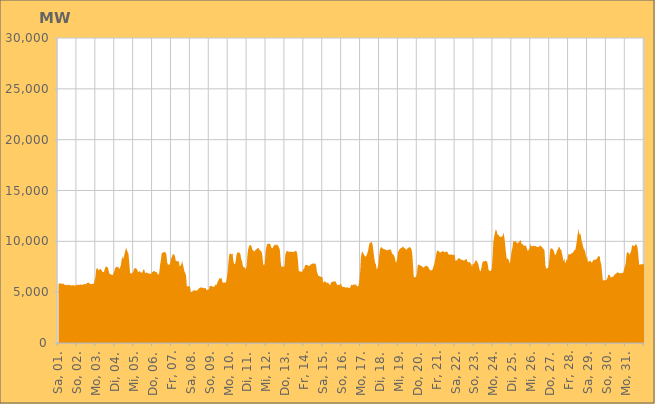
| Category | Series 0 |
|---|---|
|  Sa, 01.  | 5816.645 |
|  Sa, 01.  | 5833.543 |
|  Sa, 01.  | 5878.303 |
|  Sa, 01.  | 5857.941 |
|  Sa, 01.  | 5813.265 |
|  Sa, 01.  | 5821.119 |
|  Sa, 01.  | 5837.739 |
|  Sa, 01.  | 5802.961 |
|  Sa, 01.  | 5689.866 |
|  Sa, 01.  | 5706.973 |
|  Sa, 01.  | 5746.444 |
|  Sa, 01.  | 5684.061 |
|  Sa, 01.  | 5675.077 |
|  Sa, 01.  | 5747.231 |
|  Sa, 01.  | 5696.024 |
|  Sa, 01.  | 5694.07 |
|  Sa, 01.  | 5654.242 |
|  So, 02.  | 5658.602 |
|  So, 02.  | 5678.763 |
|  So, 02.  | 5686.817 |
|  So, 02.  | 5690.824 |
|  So, 02.  | 5626.609 |
|  So, 02.  | 5655.638 |
|  So, 02.  | 5686.847 |
|  So, 02.  | 5718.053 |
|  So, 02.  | 5741.912 |
|  So, 02.  | 5723.226 |
|  So, 02.  | 5712.971 |
|  So, 02.  | 5752.09 |
|  So, 02.  | 5741.328 |
|  So, 02.  | 5719.374 |
|  So, 02.  | 5738.254 |
|  So, 02.  | 5760.395 |
|  So, 02.  | 5807.948 |
|  So, 02.  | 5769.934 |
|  So, 02.  | 5794.8 |
|  So, 02.  | 5873.427 |
|  So, 02.  | 5922.036 |
|  So, 02.  | 5951.451 |
|  So, 02.  | 5889.006 |
|  So, 02.  | 5823.399 |
|  Mo, 03.  | 5801.55 |
|  Mo, 03.  | 5783.594 |
|  Mo, 03.  | 5803.917 |
|  Mo, 03.  | 5863.852 |
|  Mo, 03.  | 5818.78 |
|  Mo, 03.  | 6150.119 |
|  Mo, 03.  | 6477.918 |
|  Mo, 03.  | 7246.866 |
|  Mo, 03.  | 7374.99 |
|  Mo, 03.  | 7302.703 |
|  Mo, 03.  | 7142.576 |
|  Mo, 03.  | 7207.253 |
|  Mo, 03.  | 7280.673 |
|  Mo, 03.  | 7236.952 |
|  Mo, 03.  | 7135.298 |
|  Mo, 03.  | 6977.488 |
|  Mo, 03.  | 6979.522 |
|  Mo, 03.  | 7014.922 |
|  Mo, 03.  | 7313.559 |
|  Mo, 03.  | 7509.86 |
|  Mo, 03.  | 7513.885 |
|  Mo, 03.  | 7453.817 |
|  Mo, 03.  | 7392.772 |
|  Mo, 03.  | 7028.867 |
|  Di, 04.  | 6792.602 |
|  Di, 04.  | 6759.848 |
|  Di, 04.  | 6725.431 |
|  Di, 04.  | 6704.139 |
|  Di, 04.  | 6676.318 |
|  Di, 04.  | 6860.12 |
|  Di, 04.  | 7063.228 |
|  Di, 04.  | 7350.182 |
|  Di, 04.  | 7444.126 |
|  Di, 04.  | 7520.977 |
|  Di, 04.  | 7445.293 |
|  Di, 04.  | 7506.227 |
|  Di, 04.  | 7278.195 |
|  Di, 04.  | 7381.013 |
|  Di, 04.  | 7568.613 |
|  Di, 04.  | 8020.551 |
|  Di, 04.  | 8530.86 |
|  Di, 04.  | 8246.213 |
|  Di, 04.  | 8458.674 |
|  Di, 04.  | 8795.813 |
|  Di, 04.  | 9079.876 |
|  Di, 04.  | 9411.815 |
|  Di, 04.  | 9123.386 |
|  Di, 04.  | 8925.755 |
|  Mi, 05.  | 8757.629 |
|  Mi, 05.  | 7834.974 |
|  Mi, 05.  | 6837.615 |
|  Mi, 05.  | 6862.49 |
|  Mi, 05.  | 6850.363 |
|  Mi, 05.  | 6859.199 |
|  Mi, 05.  | 7006.838 |
|  Mi, 05.  | 7296.715 |
|  Mi, 05.  | 7348.667 |
|  Mi, 05.  | 7348.336 |
|  Mi, 05.  | 7333.06 |
|  Mi, 05.  | 7198.092 |
|  Mi, 05.  | 7009.681 |
|  Mi, 05.  | 7006.514 |
|  Mi, 05.  | 7059.808 |
|  Mi, 05.  | 7008.077 |
|  Mi, 05.  | 6918.037 |
|  Mi, 05.  | 6908.768 |
|  Mi, 05.  | 7042.755 |
|  Mi, 05.  | 7244.263 |
|  Mi, 05.  | 7229.735 |
|  Mi, 05.  | 6877.318 |
|  Mi, 05.  | 6890.779 |
|  Mi, 05.  | 6954.877 |
|  Do, 06.  | 6883.115 |
|  Do, 06.  | 6867.891 |
|  Do, 06.  | 6839.421 |
|  Do, 06.  | 6826.506 |
|  Do, 06.  | 6793.835 |
|  Do, 06.  | 6833.562 |
|  Do, 06.  | 6956.212 |
|  Do, 06.  | 7022.158 |
|  Do, 06.  | 7082.01 |
|  Do, 06.  | 7082.8 |
|  Do, 06.  | 6989.652 |
|  Do, 06.  | 6961.695 |
|  Do, 06.  | 6970.174 |
|  Do, 06.  | 6761.176 |
|  Do, 06.  | 6702.267 |
|  Do, 06.  | 6901.719 |
|  Do, 06.  | 7656.183 |
|  Do, 06.  | 8089.277 |
|  Do, 06.  | 8770.813 |
|  Do, 06.  | 8903.225 |
|  Do, 06.  | 8871.869 |
|  Do, 06.  | 8965.693 |
|  Do, 06.  | 8958.308 |
|  Do, 06.  | 8885.879 |
|  Fr, 07.  | 8728.444 |
|  Fr, 07.  | 7938.784 |
|  Fr, 07.  | 7748.353 |
|  Fr, 07.  | 7690.487 |
|  Fr, 07.  | 7713.119 |
|  Fr, 07.  | 7869.529 |
|  Fr, 07.  | 8298.049 |
|  Fr, 07.  | 8468.729 |
|  Fr, 07.  | 8720.527 |
|  Fr, 07.  | 8723.164 |
|  Fr, 07.  | 8695.998 |
|  Fr, 07.  | 8494.027 |
|  Fr, 07.  | 8103.364 |
|  Fr, 07.  | 8059.796 |
|  Fr, 07.  | 8010.399 |
|  Fr, 07.  | 8073.989 |
|  Fr, 07.  | 7977.426 |
|  Fr, 07.  | 7513.191 |
|  Fr, 07.  | 7624.428 |
|  Fr, 07.  | 7744.57 |
|  Fr, 07.  | 8069.878 |
|  Fr, 07.  | 7706.442 |
|  Fr, 07.  | 7399.259 |
|  Fr, 07.  | 7028.124 |
|  Sa, 08.  | 6890.17 |
|  Sa, 08.  | 6633.674 |
|  Sa, 08.  | 5583.252 |
|  Sa, 08.  | 5564.435 |
|  Sa, 08.  | 5583.643 |
|  Sa, 08.  | 5573.113 |
|  Sa, 08.  | 5556.129 |
|  Sa, 08.  | 5023.71 |
|  Sa, 08.  | 4995.188 |
|  Sa, 08.  | 5069.046 |
|  Sa, 08.  | 5132.695 |
|  Sa, 08.  | 5204.033 |
|  Sa, 08.  | 5167.089 |
|  Sa, 08.  | 5138.09 |
|  Sa, 08.  | 5182.6 |
|  Sa, 08.  | 5157.39 |
|  Sa, 08.  | 5227.657 |
|  Sa, 08.  | 5363.04 |
|  Sa, 08.  | 5380.065 |
|  Sa, 08.  | 5452.833 |
|  Sa, 08.  | 5485.961 |
|  Sa, 08.  | 5410.585 |
|  Sa, 08.  | 5438.915 |
|  Sa, 08.  | 5428.35 |
|  So, 09.  | 5375.162 |
|  So, 09.  | 5404.283 |
|  So, 09.  | 5402.728 |
|  So, 09.  | 5205.05 |
|  So, 09.  | 5212.213 |
|  So, 09.  | 5258.721 |
|  So, 09.  | 5272.45 |
|  So, 09.  | 5593.631 |
|  So, 09.  | 5615.266 |
|  So, 09.  | 5595.161 |
|  So, 09.  | 5591.979 |
|  So, 09.  | 5521.389 |
|  So, 09.  | 5542.245 |
|  So, 09.  | 5535.385 |
|  So, 09.  | 5783.627 |
|  So, 09.  | 5646.973 |
|  So, 09.  | 5775.65 |
|  So, 09.  | 6012.055 |
|  So, 09.  | 6129.645 |
|  So, 09.  | 6331.812 |
|  So, 09.  | 6343.101 |
|  So, 09.  | 6365.223 |
|  So, 09.  | 6414.256 |
|  So, 09.  | 6066.495 |
|  Mo, 10.  | 5862.603 |
|  Mo, 10.  | 5992.653 |
|  Mo, 10.  | 5934.192 |
|  Mo, 10.  | 5924.828 |
|  Mo, 10.  | 6036.854 |
|  Mo, 10.  | 6538.78 |
|  Mo, 10.  | 7059.697 |
|  Mo, 10.  | 8112.811 |
|  Mo, 10.  | 8721.013 |
|  Mo, 10.  | 8805.023 |
|  Mo, 10.  | 8772.207 |
|  Mo, 10.  | 8703.89 |
|  Mo, 10.  | 8845.539 |
|  Mo, 10.  | 8087.793 |
|  Mo, 10.  | 7780.251 |
|  Mo, 10.  | 7770.305 |
|  Mo, 10.  | 8039.012 |
|  Mo, 10.  | 8665.154 |
|  Mo, 10.  | 8888.458 |
|  Mo, 10.  | 8935.315 |
|  Mo, 10.  | 8905.289 |
|  Mo, 10.  | 8853.081 |
|  Mo, 10.  | 8746.301 |
|  Mo, 10.  | 8243.078 |
|  Di, 11.  | 8076.741 |
|  Di, 11.  | 7618.206 |
|  Di, 11.  | 7450.382 |
|  Di, 11.  | 7466.179 |
|  Di, 11.  | 7333.327 |
|  Di, 11.  | 7285.132 |
|  Di, 11.  | 7608.018 |
|  Di, 11.  | 8728.886 |
|  Di, 11.  | 9264.709 |
|  Di, 11.  | 9504.386 |
|  Di, 11.  | 9663.652 |
|  Di, 11.  | 9604.285 |
|  Di, 11.  | 9559.634 |
|  Di, 11.  | 9158.651 |
|  Di, 11.  | 9147.085 |
|  Di, 11.  | 9018.373 |
|  Di, 11.  | 8982.463 |
|  Di, 11.  | 9143.314 |
|  Di, 11.  | 9197.656 |
|  Di, 11.  | 9277.22 |
|  Di, 11.  | 9310.658 |
|  Di, 11.  | 9376.442 |
|  Di, 11.  | 9167.203 |
|  Di, 11.  | 9124.177 |
|  Mi, 12.  | 9011.812 |
|  Mi, 12.  | 8967.782 |
|  Mi, 12.  | 8471.028 |
|  Mi, 12.  | 7726.223 |
|  Mi, 12.  | 7650.477 |
|  Mi, 12.  | 7843.347 |
|  Mi, 12.  | 8981.361 |
|  Mi, 12.  | 9456.083 |
|  Mi, 12.  | 9724.692 |
|  Mi, 12.  | 9778.336 |
|  Mi, 12.  | 9747.473 |
|  Mi, 12.  | 9770.066 |
|  Mi, 12.  | 9734.751 |
|  Mi, 12.  | 9423.838 |
|  Mi, 12.  | 9354.22 |
|  Mi, 12.  | 9314.765 |
|  Mi, 12.  | 9557.487 |
|  Mi, 12.  | 9573.405 |
|  Mi, 12.  | 9679.934 |
|  Mi, 12.  | 9663.049 |
|  Mi, 12.  | 9635.505 |
|  Mi, 12.  | 9676.409 |
|  Mi, 12.  | 9518.97 |
|  Mi, 12.  | 9400.222 |
|  Do, 13.  | 9177.221 |
|  Do, 13.  | 8114.647 |
|  Do, 13.  | 7474.019 |
|  Do, 13.  | 7521.745 |
|  Do, 13.  | 7550.099 |
|  Do, 13.  | 7455.895 |
|  Do, 13.  | 7618.635 |
|  Do, 13.  | 8671.474 |
|  Do, 13.  | 8952.748 |
|  Do, 13.  | 9020.485 |
|  Do, 13.  | 9061.058 |
|  Do, 13.  | 8995.396 |
|  Do, 13.  | 8938.462 |
|  Do, 13.  | 8982.585 |
|  Do, 13.  | 8995.896 |
|  Do, 13.  | 8980.986 |
|  Do, 13.  | 8951.993 |
|  Do, 13.  | 8934.699 |
|  Do, 13.  | 9009.636 |
|  Do, 13.  | 9005.158 |
|  Do, 13.  | 9070.245 |
|  Do, 13.  | 9029.002 |
|  Do, 13.  | 8829.298 |
|  Do, 13.  | 8151.87 |
|  Fr, 14.  | 7112.168 |
|  Fr, 14.  | 7048.001 |
|  Fr, 14.  | 7022.656 |
|  Fr, 14.  | 7016.211 |
|  Fr, 14.  | 7034.101 |
|  Fr, 14.  | 7057.394 |
|  Fr, 14.  | 7293.224 |
|  Fr, 14.  | 7311.797 |
|  Fr, 14.  | 7641.42 |
|  Fr, 14.  | 7675.639 |
|  Fr, 14.  | 7690.102 |
|  Fr, 14.  | 7672.385 |
|  Fr, 14.  | 7606.425 |
|  Fr, 14.  | 7559.866 |
|  Fr, 14.  | 7623.79 |
|  Fr, 14.  | 7710.316 |
|  Fr, 14.  | 7736.737 |
|  Fr, 14.  | 7799.67 |
|  Fr, 14.  | 7825.986 |
|  Fr, 14.  | 7796.022 |
|  Fr, 14.  | 7814.803 |
|  Fr, 14.  | 7825.5 |
|  Fr, 14.  | 7663.729 |
|  Fr, 14.  | 7058.757 |
|  Sa, 15.  | 6807.523 |
|  Sa, 15.  | 6598.887 |
|  Sa, 15.  | 6564.394 |
|  Sa, 15.  | 6570.078 |
|  Sa, 15.  | 6496.994 |
|  Sa, 15.  | 6482.944 |
|  Sa, 15.  | 6507.312 |
|  Sa, 15.  | 5905.573 |
|  Sa, 15.  | 6044.369 |
|  Sa, 15.  | 6088.623 |
|  Sa, 15.  | 6019.353 |
|  Sa, 15.  | 5937.678 |
|  Sa, 15.  | 5898.209 |
|  Sa, 15.  | 5962.256 |
|  Sa, 15.  | 5866.236 |
|  Sa, 15.  | 5707.587 |
|  Sa, 15.  | 5719.776 |
|  Sa, 15.  | 5942.887 |
|  Sa, 15.  | 5997.819 |
|  Sa, 15.  | 6032.344 |
|  Sa, 15.  | 6057.356 |
|  Sa, 15.  | 6030.518 |
|  Sa, 15.  | 6065.009 |
|  Sa, 15.  | 6052.457 |
|  So, 16.  | 5836.638 |
|  So, 16.  | 5706.575 |
|  So, 16.  | 5707.869 |
|  So, 16.  | 5726.732 |
|  So, 16.  | 5731.288 |
|  So, 16.  | 5771.135 |
|  So, 16.  | 5782.073 |
|  So, 16.  | 5524.822 |
|  So, 16.  | 5534.935 |
|  So, 16.  | 5508.416 |
|  So, 16.  | 5512.746 |
|  So, 16.  | 5473.049 |
|  So, 16.  | 5415.752 |
|  So, 16.  | 5483.737 |
|  So, 16.  | 5476.291 |
|  So, 16.  | 5433.365 |
|  So, 16.  | 5415.68 |
|  So, 16.  | 5426.402 |
|  So, 16.  | 5588.846 |
|  So, 16.  | 5741.849 |
|  So, 16.  | 5697.924 |
|  So, 16.  | 5682.73 |
|  So, 16.  | 5792.837 |
|  So, 16.  | 5728.978 |
|  Mo, 17.  | 5755.943 |
|  Mo, 17.  | 5716.872 |
|  Mo, 17.  | 5539.913 |
|  Mo, 17.  | 5580.236 |
|  Mo, 17.  | 5669.963 |
|  Mo, 17.  | 6192.205 |
|  Mo, 17.  | 6990.774 |
|  Mo, 17.  | 8472.941 |
|  Mo, 17.  | 8877.639 |
|  Mo, 17.  | 8995.747 |
|  Mo, 17.  | 8825.526 |
|  Mo, 17.  | 8648.156 |
|  Mo, 17.  | 8563.979 |
|  Mo, 17.  | 8469.505 |
|  Mo, 17.  | 8596.41 |
|  Mo, 17.  | 8808.88 |
|  Mo, 17.  | 9063.486 |
|  Mo, 17.  | 9494.846 |
|  Mo, 17.  | 9824.431 |
|  Mo, 17.  | 9879.286 |
|  Mo, 17.  | 9902.182 |
|  Mo, 17.  | 9908.689 |
|  Mo, 17.  | 9541.884 |
|  Mo, 17.  | 8942.173 |
|  Di, 18.  | 8304.556 |
|  Di, 18.  | 7866.418 |
|  Di, 18.  | 7752.92 |
|  Di, 18.  | 7232.025 |
|  Di, 18.  | 7388.881 |
|  Di, 18.  | 7755.89 |
|  Di, 18.  | 8489.874 |
|  Di, 18.  | 9165.235 |
|  Di, 18.  | 9379.632 |
|  Di, 18.  | 9427.655 |
|  Di, 18.  | 9375.063 |
|  Di, 18.  | 9253.425 |
|  Di, 18.  | 9247.663 |
|  Di, 18.  | 9211.881 |
|  Di, 18.  | 9193.004 |
|  Di, 18.  | 9156.579 |
|  Di, 18.  | 9080.882 |
|  Di, 18.  | 9145.31 |
|  Di, 18.  | 9149.555 |
|  Di, 18.  | 9205.161 |
|  Di, 18.  | 9170.764 |
|  Di, 18.  | 9214.088 |
|  Di, 18.  | 8915.83 |
|  Di, 18.  | 8735.805 |
|  Mi, 19.  | 8722.167 |
|  Mi, 19.  | 8562.322 |
|  Mi, 19.  | 8399.129 |
|  Mi, 19.  | 7986.45 |
|  Mi, 19.  | 7917.184 |
|  Mi, 19.  | 8352.722 |
|  Mi, 19.  | 8907.322 |
|  Mi, 19.  | 9083.245 |
|  Mi, 19.  | 9235.338 |
|  Mi, 19.  | 9299.777 |
|  Mi, 19.  | 9355.43 |
|  Mi, 19.  | 9374.602 |
|  Mi, 19.  | 9496.208 |
|  Mi, 19.  | 9420.226 |
|  Mi, 19.  | 9331.025 |
|  Mi, 19.  | 9299.388 |
|  Mi, 19.  | 9196.505 |
|  Mi, 19.  | 9199.866 |
|  Mi, 19.  | 9297.241 |
|  Mi, 19.  | 9348.211 |
|  Mi, 19.  | 9396.245 |
|  Mi, 19.  | 9458.066 |
|  Mi, 19.  | 9352.916 |
|  Mi, 19.  | 9249.11 |
|  Do, 20.  | 8873.193 |
|  Do, 20.  | 7791.259 |
|  Do, 20.  | 6537.543 |
|  Do, 20.  | 6453.17 |
|  Do, 20.  | 6468.559 |
|  Do, 20.  | 6549.581 |
|  Do, 20.  | 6835.472 |
|  Do, 20.  | 7594.804 |
|  Do, 20.  | 7722.34 |
|  Do, 20.  | 7713.681 |
|  Do, 20.  | 7634.668 |
|  Do, 20.  | 7610.11 |
|  Do, 20.  | 7560.545 |
|  Do, 20.  | 7499.909 |
|  Do, 20.  | 7427.57 |
|  Do, 20.  | 7430.578 |
|  Do, 20.  | 7515.117 |
|  Do, 20.  | 7582.145 |
|  Do, 20.  | 7596.65 |
|  Do, 20.  | 7557.312 |
|  Do, 20.  | 7552.486 |
|  Do, 20.  | 7381.131 |
|  Do, 20.  | 7234.194 |
|  Do, 20.  | 7174.279 |
|  Fr, 21.  | 7095.851 |
|  Fr, 21.  | 7222.117 |
|  Fr, 21.  | 7217.386 |
|  Fr, 21.  | 7524.087 |
|  Fr, 21.  | 7717.482 |
|  Fr, 21.  | 8145.158 |
|  Fr, 21.  | 8455.463 |
|  Fr, 21.  | 8919.347 |
|  Fr, 21.  | 9116.77 |
|  Fr, 21.  | 9063.508 |
|  Fr, 21.  | 9013.472 |
|  Fr, 21.  | 8911.443 |
|  Fr, 21.  | 8890.675 |
|  Fr, 21.  | 8963.941 |
|  Fr, 21.  | 8993.031 |
|  Fr, 21.  | 9028.128 |
|  Fr, 21.  | 9023.55 |
|  Fr, 21.  | 8912.177 |
|  Fr, 21.  | 8935.423 |
|  Fr, 21.  | 8992.964 |
|  Fr, 21.  | 8982.792 |
|  Fr, 21.  | 8919.734 |
|  Fr, 21.  | 8733.113 |
|  Fr, 21.  | 8664.263 |
|  Sa, 22.  | 8695.503 |
|  Sa, 22.  | 8697.679 |
|  Sa, 22.  | 8720.887 |
|  Sa, 22.  | 8664.154 |
|  Sa, 22.  | 8642.655 |
|  Sa, 22.  | 8707.702 |
|  Sa, 22.  | 8648.933 |
|  Sa, 22.  | 8048.463 |
|  Sa, 22.  | 8145.331 |
|  Sa, 22.  | 8121.169 |
|  Sa, 22.  | 8295.478 |
|  Sa, 22.  | 8308.114 |
|  Sa, 22.  | 8336.875 |
|  Sa, 22.  | 8288.442 |
|  Sa, 22.  | 8196.497 |
|  Sa, 22.  | 8154.393 |
|  Sa, 22.  | 8196.02 |
|  Sa, 22.  | 8119.624 |
|  Sa, 22.  | 8123.94 |
|  Sa, 22.  | 8167.348 |
|  Sa, 22.  | 8210.633 |
|  Sa, 22.  | 8293.763 |
|  Sa, 22.  | 7999.539 |
|  Sa, 22.  | 7951.692 |
|  So, 23.  | 7927.374 |
|  So, 23.  | 7976.89 |
|  So, 23.  | 7841.859 |
|  So, 23.  | 7753.3 |
|  So, 23.  | 7496.856 |
|  So, 23.  | 7830.184 |
|  So, 23.  | 7744.589 |
|  So, 23.  | 7849.63 |
|  So, 23.  | 8041.109 |
|  So, 23.  | 8139.626 |
|  So, 23.  | 8083.127 |
|  So, 23.  | 7908.895 |
|  So, 23.  | 7757.814 |
|  So, 23.  | 7366.029 |
|  So, 23.  | 7080.65 |
|  So, 23.  | 7055.919 |
|  So, 23.  | 7439.333 |
|  So, 23.  | 7888.322 |
|  So, 23.  | 8022.352 |
|  So, 23.  | 8045.66 |
|  So, 23.  | 8003.767 |
|  So, 23.  | 8096.979 |
|  So, 23.  | 8051.646 |
|  So, 23.  | 8037.05 |
|  Mo, 24.  | 7680.295 |
|  Mo, 24.  | 7189.434 |
|  Mo, 24.  | 7126.988 |
|  Mo, 24.  | 7074.014 |
|  Mo, 24.  | 7100.594 |
|  Mo, 24.  | 7284.589 |
|  Mo, 24.  | 8324.837 |
|  Mo, 24.  | 9862.552 |
|  Mo, 24.  | 10444.06 |
|  Mo, 24.  | 10823.249 |
|  Mo, 24.  | 11155.616 |
|  Mo, 24.  | 11081.164 |
|  Mo, 24.  | 10753.987 |
|  Mo, 24.  | 10628.393 |
|  Mo, 24.  | 10615.3 |
|  Mo, 24.  | 10446.505 |
|  Mo, 24.  | 10461.827 |
|  Mo, 24.  | 10444.399 |
|  Mo, 24.  | 10446.408 |
|  Mo, 24.  | 10562.118 |
|  Mo, 24.  | 10888.566 |
|  Mo, 24.  | 10404.719 |
|  Mo, 24.  | 9683.399 |
|  Mo, 24.  | 8891.409 |
|  Di, 25.  | 8260.644 |
|  Di, 25.  | 8332.102 |
|  Di, 25.  | 8259.257 |
|  Di, 25.  | 8042.422 |
|  Di, 25.  | 7804.713 |
|  Di, 25.  | 8331.094 |
|  Di, 25.  | 8932.042 |
|  Di, 25.  | 9242.74 |
|  Di, 25.  | 9813.657 |
|  Di, 25.  | 10091.042 |
|  Di, 25.  | 9941.061 |
|  Di, 25.  | 10056.733 |
|  Di, 25.  | 9896.833 |
|  Di, 25.  | 9870.804 |
|  Di, 25.  | 9782.041 |
|  Di, 25.  | 9890.785 |
|  Di, 25.  | 9966.496 |
|  Di, 25.  | 10113.414 |
|  Di, 25.  | 10048.127 |
|  Di, 25.  | 9704.103 |
|  Di, 25.  | 9774.01 |
|  Di, 25.  | 9614.406 |
|  Di, 25.  | 9547.656 |
|  Di, 25.  | 9587.772 |
|  Mi, 26.  | 9581.004 |
|  Mi, 26.  | 9465.8 |
|  Mi, 26.  | 9130.847 |
|  Mi, 26.  | 9078.165 |
|  Mi, 26.  | 9186.47 |
|  Mi, 26.  | 9319.42 |
|  Mi, 26.  | 9707.802 |
|  Mi, 26.  | 9563.378 |
|  Mi, 26.  | 9505.396 |
|  Mi, 26.  | 9519.849 |
|  Mi, 26.  | 9566.772 |
|  Mi, 26.  | 9527.947 |
|  Mi, 26.  | 9572.411 |
|  Mi, 26.  | 9518.96 |
|  Mi, 26.  | 9462.552 |
|  Mi, 26.  | 9448.56 |
|  Mi, 26.  | 9440.932 |
|  Mi, 26.  | 9506.172 |
|  Mi, 26.  | 9509.901 |
|  Mi, 26.  | 9586.337 |
|  Mi, 26.  | 9495.775 |
|  Mi, 26.  | 9420.733 |
|  Mi, 26.  | 9279.415 |
|  Mi, 26.  | 9258.74 |
|  Do, 27.  | 9066.436 |
|  Do, 27.  | 7678.996 |
|  Do, 27.  | 7311.805 |
|  Do, 27.  | 7354.534 |
|  Do, 27.  | 7382.034 |
|  Do, 27.  | 7446.375 |
|  Do, 27.  | 8184.87 |
|  Do, 27.  | 9156.029 |
|  Do, 27.  | 9296.102 |
|  Do, 27.  | 9311.57 |
|  Do, 27.  | 9279.914 |
|  Do, 27.  | 9140.283 |
|  Do, 27.  | 9027.293 |
|  Do, 27.  | 8669.426 |
|  Do, 27.  | 8665.152 |
|  Do, 27.  | 8855.865 |
|  Do, 27.  | 9114.621 |
|  Do, 27.  | 9207.902 |
|  Do, 27.  | 9442.19 |
|  Do, 27.  | 9440.291 |
|  Do, 27.  | 9204.22 |
|  Do, 27.  | 9207.686 |
|  Do, 27.  | 8844.771 |
|  Do, 27.  | 8494.999 |
|  Fr, 28.  | 8002.009 |
|  Fr, 28.  | 8352.176 |
|  Fr, 28.  | 7947.996 |
|  Fr, 28.  | 7873.485 |
|  Fr, 28.  | 8274.46 |
|  Fr, 28.  | 8111.919 |
|  Fr, 28.  | 8654.225 |
|  Fr, 28.  | 8804.443 |
|  Fr, 28.  | 8680.026 |
|  Fr, 28.  | 8726.344 |
|  Fr, 28.  | 8789.763 |
|  Fr, 28.  | 8864.094 |
|  Fr, 28.  | 8882.087 |
|  Fr, 28.  | 9015.274 |
|  Fr, 28.  | 9162.455 |
|  Fr, 28.  | 9138.682 |
|  Fr, 28.  | 9527.918 |
|  Fr, 28.  | 10039.091 |
|  Fr, 28.  | 10697.173 |
|  Fr, 28.  | 11274.524 |
|  Fr, 28.  | 10631.21 |
|  Fr, 28.  | 10818.278 |
|  Fr, 28.  | 10593.299 |
|  Fr, 28.  | 10068.321 |
|  Sa, 29.  | 9801.448 |
|  Sa, 29.  | 9458.226 |
|  Sa, 29.  | 9204.249 |
|  Sa, 29.  | 9147.269 |
|  Sa, 29.  | 8817.02 |
|  Sa, 29.  | 8310.015 |
|  Sa, 29.  | 8557.211 |
|  Sa, 29.  | 7999.37 |
|  Sa, 29.  | 8006.239 |
|  Sa, 29.  | 8075.698 |
|  Sa, 29.  | 8069.272 |
|  Sa, 29.  | 7999.652 |
|  Sa, 29.  | 7876.117 |
|  Sa, 29.  | 8019.812 |
|  Sa, 29.  | 8187.631 |
|  Sa, 29.  | 8150.531 |
|  Sa, 29.  | 8195.012 |
|  Sa, 29.  | 8194.026 |
|  Sa, 29.  | 8251.734 |
|  Sa, 29.  | 8367.6 |
|  Sa, 29.  | 8552.846 |
|  Sa, 29.  | 8492.058 |
|  Sa, 29.  | 8560.024 |
|  Sa, 29.  | 7993.58 |
|  So, 30.  | 7732.792 |
|  So, 30.  | 6928.243 |
|  So, 30.  | 6149.037 |
|  So, 30.  | 6188.188 |
|  So, 30.  | 6154.964 |
|  So, 30.  | 6170.289 |
|  So, 30.  | 6199.798 |
|  So, 30.  | 6262.831 |
|  So, 30.  | 6426.431 |
|  So, 30.  | 6691.94 |
|  So, 30.  | 6740.725 |
|  So, 30.  | 6640.515 |
|  So, 30.  | 6430.253 |
|  So, 30.  | 6472.372 |
|  So, 30.  | 6554.004 |
|  So, 30.  | 6472.367 |
|  So, 30.  | 6633.359 |
|  So, 30.  | 6731.332 |
|  So, 30.  | 6794.817 |
|  So, 30.  | 6844.06 |
|  So, 30.  | 6920.783 |
|  So, 30.  | 6954.566 |
|  So, 30.  | 6901.078 |
|  So, 30.  | 6863.818 |
|  So, 30.  | 6864.814 |
|  Mo, 31.  | 6864.806 |
|  Mo, 31.  | 6903.885 |
|  Mo, 31.  | 6886.68 |
|  Mo, 31.  | 6912.15 |
|  Mo, 31.  | 7282.263 |
|  Mo, 31.  | 7501.69 |
|  Mo, 31.  | 7832.402 |
|  Mo, 31.  | 8688.391 |
|  Mo, 31.  | 8946.175 |
|  Mo, 31.  | 8900.694 |
|  Mo, 31.  | 8826.408 |
|  Mo, 31.  | 8666.175 |
|  Mo, 31.  | 8885.088 |
|  Mo, 31.  | 9062.895 |
|  Mo, 31.  | 9505.37 |
|  Mo, 31.  | 9649.043 |
|  Mo, 31.  | 9535.645 |
|  Mo, 31.  | 9525.885 |
|  Mo, 31.  | 9638.825 |
|  Mo, 31.  | 9745.406 |
|  Mo, 31.  | 9587.271 |
|  Mo, 31.  | 9404.507 |
|  Mo, 31.  | 8663.879 |
|  Mo, 31.  | 7736.19 |
|  Di, 01.  | 7683.965 |
|  Di, 01.  | 7751.482 |
|  Di, 01.  | 7765.122 |
|  Di, 01.  | 7715.107 |
|  Di, 01.  | 7758.039 |